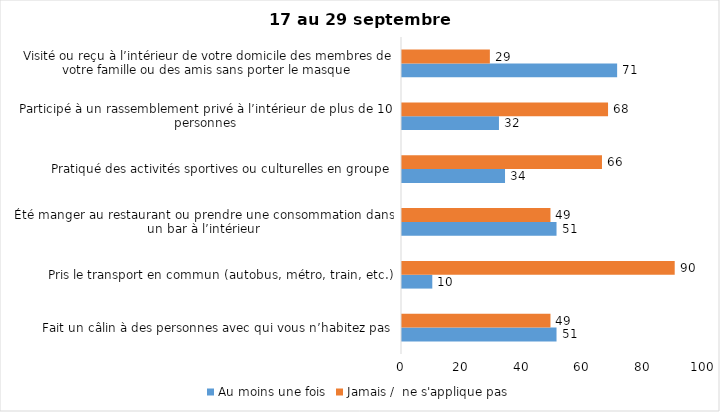
| Category | Au moins une fois | Jamais /  ne s'applique pas |
|---|---|---|
| Fait un câlin à des personnes avec qui vous n’habitez pas | 51 | 49 |
| Pris le transport en commun (autobus, métro, train, etc.) | 10 | 90 |
| Été manger au restaurant ou prendre une consommation dans un bar à l’intérieur | 51 | 49 |
| Pratiqué des activités sportives ou culturelles en groupe | 34 | 66 |
| Participé à un rassemblement privé à l’intérieur de plus de 10 personnes | 32 | 68 |
| Visité ou reçu à l’intérieur de votre domicile des membres de votre famille ou des amis sans porter le masque | 71 | 29 |